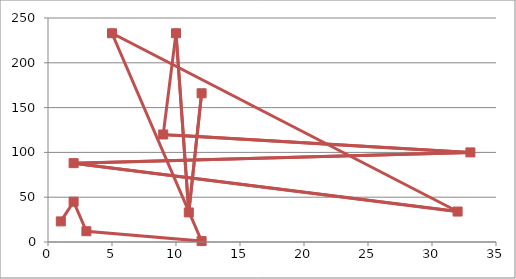
| Category | Series 1 |
|---|---|
| 1.0 | 23 |
| 2.0 | 45 |
| 3.0 | 12 |
| 12.0 | 1 |
| 5.0 | 233 |
| 32.0 | 34 |
| 2.0 | 88 |
| 33.0 | 100 |
| 9.0 | 120 |
| 10.0 | 233 |
| 11.0 | 33 |
| 12.0 | 166 |